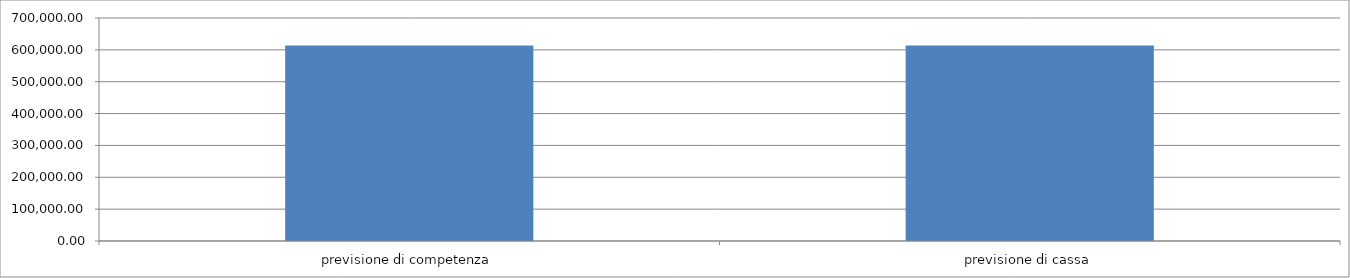
| Category | Series 0 |
|---|---|
| previsione di competenza | 613334 |
| previsione di cassa | 613334 |